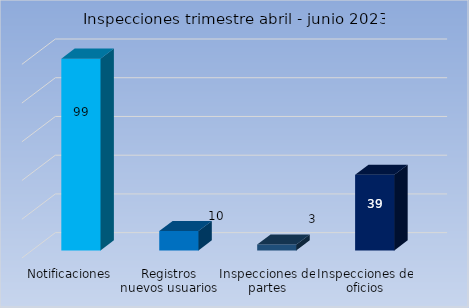
| Category | Cantidad |
|---|---|
| Notificaciones | 99 |
| Registros nuevos usuarios | 10 |
| Inspecciones de partes | 3 |
| Inspecciones de oficios | 39 |